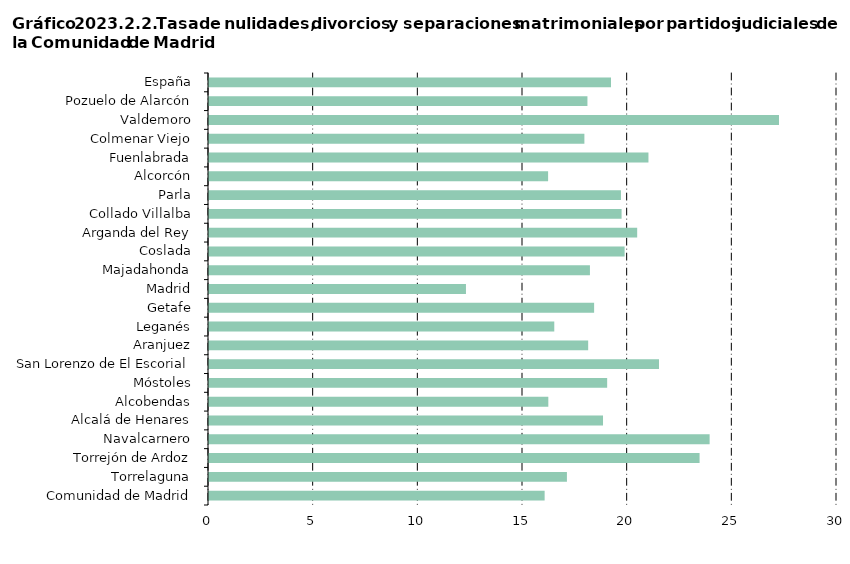
| Category | Series 0 |
|---|---|
| Comunidad de Madrid | 16.033 |
|     Torrelaguna | 17.098 |
|     Torrejón de Ardoz | 23.435 |
|     Navalcarnero | 23.915 |
|     Alcalá de Henares | 18.823 |
|     Alcobendas | 16.209 |
|     Móstoles | 19.02 |
|     San Lorenzo de El Escorial | 21.496 |
|     Aranjuez | 18.114 |
|     Leganés | 16.494 |
|     Getafe | 18.398 |
|     Madrid | 12.275 |
|     Majadahonda | 18.197 |
|     Coslada | 19.854 |
|     Arganda del Rey | 20.454 |
|     Collado Villalba | 19.709 |
|     Parla | 19.679 |
|     Alcorcón | 16.199 |
|     Fuenlabrada | 20.993 |
|     Colmenar Viejo | 17.933 |
|     Valdemoro | 27.229 |
|     Pozuelo de Alarcón | 18.078 |
| España | 19.204 |